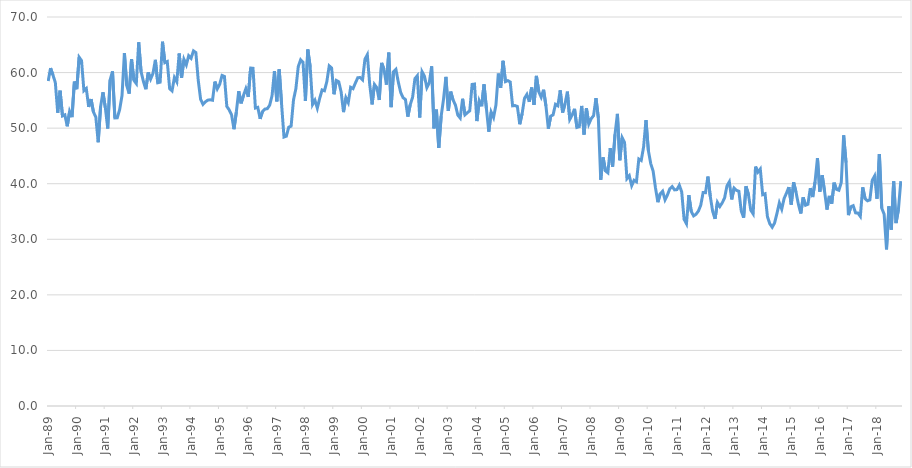
| Category | Series 0 |
|---|---|
| 1989-01-01 | 58.476 |
| 1989-02-01 | 60.805 |
| 1989-03-01 | 59.563 |
| 1989-04-01 | 58.199 |
| 1989-05-01 | 52.771 |
| 1989-06-01 | 56.74 |
| 1989-07-01 | 52.194 |
| 1989-08-01 | 52.388 |
| 1989-09-01 | 50.334 |
| 1989-10-01 | 53.029 |
| 1989-11-01 | 51.982 |
| 1989-12-01 | 58.38 |
| 1990-01-01 | 57.001 |
| 1990-02-01 | 62.763 |
| 1990-03-01 | 62.148 |
| 1990-04-01 | 56.734 |
| 1990-05-01 | 57.134 |
| 1990-06-01 | 53.812 |
| 1990-07-01 | 55.229 |
| 1990-08-01 | 52.904 |
| 1990-09-01 | 51.992 |
| 1990-10-01 | 47.461 |
| 1990-11-01 | 53.862 |
| 1990-12-01 | 56.446 |
| 1991-01-01 | 53.679 |
| 1991-02-01 | 49.93 |
| 1991-03-01 | 58.68 |
| 1991-04-01 | 60.21 |
| 1991-05-01 | 51.835 |
| 1991-06-01 | 51.866 |
| 1991-07-01 | 53.309 |
| 1991-08-01 | 55.859 |
| 1991-09-01 | 63.5 |
| 1991-10-01 | 57.649 |
| 1991-11-01 | 56.202 |
| 1991-12-01 | 62.431 |
| 1992-01-01 | 58.599 |
| 1992-02-01 | 58.019 |
| 1992-03-01 | 65.45 |
| 1992-04-01 | 60.162 |
| 1992-05-01 | 58.385 |
| 1992-06-01 | 57.008 |
| 1992-07-01 | 60.03 |
| 1992-08-01 | 58.82 |
| 1992-09-01 | 59.847 |
| 1992-10-01 | 62.292 |
| 1992-11-01 | 58.163 |
| 1992-12-01 | 58.268 |
| 1993-01-01 | 65.554 |
| 1993-02-01 | 61.788 |
| 1993-03-01 | 61.991 |
| 1993-04-01 | 57.108 |
| 1993-05-01 | 56.71 |
| 1993-06-01 | 59.105 |
| 1993-07-01 | 58.329 |
| 1993-08-01 | 63.434 |
| 1993-09-01 | 59.043 |
| 1993-10-01 | 62.37 |
| 1993-11-01 | 61.391 |
| 1993-12-01 | 63.038 |
| 1994-01-01 | 62.577 |
| 1994-02-01 | 63.901 |
| 1994-03-01 | 63.6 |
| 1994-04-01 | 58.629 |
| 1994-05-01 | 55.195 |
| 1994-06-01 | 54.279 |
| 1994-07-01 | 54.732 |
| 1994-08-01 | 55.04 |
| 1994-09-01 | 55.103 |
| 1994-10-01 | 55.018 |
| 1994-11-01 | 58.382 |
| 1994-12-01 | 57.064 |
| 1995-01-01 | 57.873 |
| 1995-02-01 | 59.483 |
| 1995-03-01 | 59.305 |
| 1995-04-01 | 53.919 |
| 1995-05-01 | 53.285 |
| 1995-06-01 | 52.386 |
| 1995-07-01 | 49.814 |
| 1995-08-01 | 52.905 |
| 1995-09-01 | 56.648 |
| 1995-10-01 | 54.461 |
| 1995-11-01 | 55.892 |
| 1995-12-01 | 57.097 |
| 1996-01-01 | 55.634 |
| 1996-02-01 | 60.813 |
| 1996-03-01 | 60.767 |
| 1996-04-01 | 53.622 |
| 1996-05-01 | 53.746 |
| 1996-06-01 | 51.67 |
| 1996-07-01 | 53.002 |
| 1996-08-01 | 53.427 |
| 1996-09-01 | 53.503 |
| 1996-10-01 | 54.13 |
| 1996-11-01 | 55.851 |
| 1996-12-01 | 60.279 |
| 1997-01-01 | 54.816 |
| 1997-02-01 | 60.572 |
| 1997-03-01 | 54.317 |
| 1997-04-01 | 48.401 |
| 1997-05-01 | 48.558 |
| 1997-06-01 | 50.174 |
| 1997-07-01 | 50.357 |
| 1997-08-01 | 55.075 |
| 1997-09-01 | 57.1 |
| 1997-10-01 | 61.076 |
| 1997-11-01 | 62.3 |
| 1997-12-01 | 61.842 |
| 1998-01-01 | 54.889 |
| 1998-02-01 | 64.154 |
| 1998-03-01 | 61.067 |
| 1998-04-01 | 54.255 |
| 1998-05-01 | 55.02 |
| 1998-06-01 | 53.593 |
| 1998-07-01 | 55.362 |
| 1998-08-01 | 56.874 |
| 1998-09-01 | 56.721 |
| 1998-10-01 | 58.387 |
| 1998-11-01 | 61.204 |
| 1998-12-01 | 60.831 |
| 1999-01-01 | 56.098 |
| 1999-02-01 | 58.582 |
| 1999-03-01 | 58.349 |
| 1999-04-01 | 56.505 |
| 1999-05-01 | 52.883 |
| 1999-06-01 | 55.481 |
| 1999-07-01 | 54.605 |
| 1999-08-01 | 57.352 |
| 1999-09-01 | 57.111 |
| 1999-10-01 | 58.136 |
| 1999-11-01 | 59.083 |
| 1999-12-01 | 59.1 |
| 2000-01-01 | 58.685 |
| 2000-02-01 | 62.412 |
| 2000-03-01 | 63.209 |
| 2000-04-01 | 57.855 |
| 2000-05-01 | 54.276 |
| 2000-06-01 | 57.855 |
| 2000-07-01 | 57.269 |
| 2000-08-01 | 55.069 |
| 2000-09-01 | 61.733 |
| 2000-10-01 | 60.599 |
| 2000-11-01 | 57.85 |
| 2000-12-01 | 63.595 |
| 2001-01-01 | 53.777 |
| 2001-02-01 | 60.146 |
| 2001-03-01 | 60.581 |
| 2001-04-01 | 58.302 |
| 2001-05-01 | 56.436 |
| 2001-06-01 | 55.485 |
| 2001-07-01 | 55.152 |
| 2001-08-01 | 52.072 |
| 2001-09-01 | 54.207 |
| 2001-10-01 | 55.53 |
| 2001-11-01 | 58.918 |
| 2001-12-01 | 59.438 |
| 2002-01-01 | 51.914 |
| 2002-02-01 | 60.141 |
| 2002-03-01 | 59.345 |
| 2002-04-01 | 57.276 |
| 2002-05-01 | 58.13 |
| 2002-06-01 | 61.121 |
| 2002-07-01 | 49.965 |
| 2002-08-01 | 53.324 |
| 2002-09-01 | 46.434 |
| 2002-10-01 | 52.152 |
| 2002-11-01 | 55.222 |
| 2002-12-01 | 59.213 |
| 2003-01-01 | 53.094 |
| 2003-02-01 | 56.569 |
| 2003-03-01 | 55.089 |
| 2003-04-01 | 54.145 |
| 2003-05-01 | 52.346 |
| 2003-06-01 | 51.814 |
| 2003-07-01 | 55.285 |
| 2003-08-01 | 52.398 |
| 2003-09-01 | 52.777 |
| 2003-10-01 | 53.118 |
| 2003-11-01 | 57.87 |
| 2003-12-01 | 57.933 |
| 2004-01-01 | 51.27 |
| 2004-02-01 | 54.919 |
| 2004-03-01 | 53.939 |
| 2004-04-01 | 57.877 |
| 2004-05-01 | 53.536 |
| 2004-06-01 | 49.357 |
| 2004-07-01 | 52.888 |
| 2004-08-01 | 51.927 |
| 2004-09-01 | 54.145 |
| 2004-10-01 | 59.83 |
| 2004-11-01 | 57.275 |
| 2004-12-01 | 62.119 |
| 2005-01-01 | 58.373 |
| 2005-02-01 | 58.559 |
| 2005-03-01 | 58.3 |
| 2005-04-01 | 54.015 |
| 2005-05-01 | 54.065 |
| 2005-06-01 | 53.904 |
| 2005-07-01 | 50.699 |
| 2005-08-01 | 52.617 |
| 2005-09-01 | 55.378 |
| 2005-10-01 | 56.069 |
| 2005-11-01 | 54.738 |
| 2005-12-01 | 57.309 |
| 2006-01-01 | 54.194 |
| 2006-02-01 | 59.402 |
| 2006-03-01 | 56.529 |
| 2006-04-01 | 55.567 |
| 2006-05-01 | 56.906 |
| 2006-06-01 | 53.992 |
| 2006-07-01 | 49.9 |
| 2006-08-01 | 52.156 |
| 2006-09-01 | 52.392 |
| 2006-10-01 | 54.285 |
| 2006-11-01 | 54.025 |
| 2006-12-01 | 56.807 |
| 2007-01-01 | 52.813 |
| 2007-02-01 | 54.334 |
| 2007-03-01 | 56.568 |
| 2007-04-01 | 51.563 |
| 2007-05-01 | 52.356 |
| 2007-06-01 | 53.475 |
| 2007-07-01 | 50.129 |
| 2007-08-01 | 50.267 |
| 2007-09-01 | 53.998 |
| 2007-10-01 | 48.853 |
| 2007-11-01 | 53.576 |
| 2007-12-01 | 50.742 |
| 2008-01-01 | 51.7 |
| 2008-02-01 | 52.255 |
| 2008-03-01 | 55.404 |
| 2008-04-01 | 51.835 |
| 2008-05-01 | 40.712 |
| 2008-06-01 | 44.732 |
| 2008-07-01 | 42.307 |
| 2008-08-01 | 41.962 |
| 2008-09-01 | 46.412 |
| 2008-10-01 | 43.085 |
| 2008-11-01 | 48.877 |
| 2008-12-01 | 52.565 |
| 2009-01-01 | 44.223 |
| 2009-02-01 | 48.286 |
| 2009-03-01 | 47.419 |
| 2009-04-01 | 40.914 |
| 2009-05-01 | 41.438 |
| 2009-06-01 | 39.658 |
| 2009-07-01 | 40.622 |
| 2009-08-01 | 40.352 |
| 2009-09-01 | 44.447 |
| 2009-10-01 | 44.183 |
| 2009-11-01 | 46.612 |
| 2009-12-01 | 51.432 |
| 2010-01-01 | 45.977 |
| 2010-02-01 | 43.622 |
| 2010-03-01 | 42.273 |
| 2010-04-01 | 39.222 |
| 2010-05-01 | 36.686 |
| 2010-06-01 | 38.21 |
| 2010-07-01 | 38.649 |
| 2010-08-01 | 37.109 |
| 2010-09-01 | 37.977 |
| 2010-10-01 | 39.081 |
| 2010-11-01 | 39.481 |
| 2010-12-01 | 38.895 |
| 2011-01-01 | 38.938 |
| 2011-02-01 | 39.735 |
| 2011-03-01 | 38.528 |
| 2011-04-01 | 33.608 |
| 2011-05-01 | 32.797 |
| 2011-06-01 | 37.94 |
| 2011-07-01 | 35.018 |
| 2011-08-01 | 34.212 |
| 2011-09-01 | 34.503 |
| 2011-10-01 | 35.069 |
| 2011-11-01 | 36.133 |
| 2011-12-01 | 38.42 |
| 2012-01-01 | 38.392 |
| 2012-02-01 | 41.285 |
| 2012-03-01 | 37.723 |
| 2012-04-01 | 35.018 |
| 2012-05-01 | 33.679 |
| 2012-06-01 | 36.637 |
| 2012-07-01 | 35.892 |
| 2012-08-01 | 36.553 |
| 2012-09-01 | 37.413 |
| 2012-10-01 | 39.598 |
| 2012-11-01 | 40.342 |
| 2012-12-01 | 37.174 |
| 2013-01-01 | 39.206 |
| 2013-02-01 | 38.806 |
| 2013-03-01 | 38.648 |
| 2013-04-01 | 35.116 |
| 2013-05-01 | 33.89 |
| 2013-06-01 | 39.541 |
| 2013-07-01 | 38.111 |
| 2013-08-01 | 35.239 |
| 2013-09-01 | 34.58 |
| 2013-10-01 | 43.076 |
| 2013-11-01 | 42.082 |
| 2013-12-01 | 42.639 |
| 2014-01-01 | 38.034 |
| 2014-02-01 | 38.198 |
| 2014-03-01 | 34.079 |
| 2014-04-01 | 32.799 |
| 2014-05-01 | 32.169 |
| 2014-06-01 | 32.932 |
| 2014-07-01 | 34.658 |
| 2014-08-01 | 36.554 |
| 2014-09-01 | 35.42 |
| 2014-10-01 | 37.354 |
| 2014-11-01 | 38.307 |
| 2014-12-01 | 39.385 |
| 2015-01-01 | 36.241 |
| 2015-02-01 | 40.25 |
| 2015-03-01 | 38.476 |
| 2015-04-01 | 36.309 |
| 2015-05-01 | 34.645 |
| 2015-06-01 | 37.538 |
| 2015-07-01 | 36.132 |
| 2015-08-01 | 36.302 |
| 2015-09-01 | 39.2 |
| 2015-10-01 | 37.602 |
| 2015-11-01 | 40.361 |
| 2015-12-01 | 44.616 |
| 2016-01-01 | 38.573 |
| 2016-02-01 | 41.526 |
| 2016-03-01 | 38.574 |
| 2016-04-01 | 35.34 |
| 2016-05-01 | 37.805 |
| 2016-06-01 | 36.404 |
| 2016-07-01 | 40.188 |
| 2016-08-01 | 38.98 |
| 2016-09-01 | 38.831 |
| 2016-10-01 | 40.223 |
| 2016-11-01 | 48.708 |
| 2016-12-01 | 43.814 |
| 2017-01-01 | 34.355 |
| 2017-02-01 | 35.857 |
| 2017-03-01 | 36.047 |
| 2017-04-01 | 34.751 |
| 2017-05-01 | 34.724 |
| 2017-06-01 | 34.122 |
| 2017-07-01 | 39.351 |
| 2017-08-01 | 37.31 |
| 2017-09-01 | 36.927 |
| 2017-10-01 | 37.082 |
| 2017-11-01 | 40.601 |
| 2017-12-01 | 41.39 |
| 2018-01-01 | 37.289 |
| 2018-02-01 | 45.354 |
| 2018-03-01 | 35.595 |
| 2018-04-01 | 34.515 |
| 2018-05-01 | 28.195 |
| 2018-06-01 | 35.911 |
| 2018-07-01 | 31.745 |
| 2018-08-01 | 40.422 |
| 2018-09-01 | 32.919 |
| 2018-10-01 | 35.368 |
| 2018-11-01 | 40.464 |